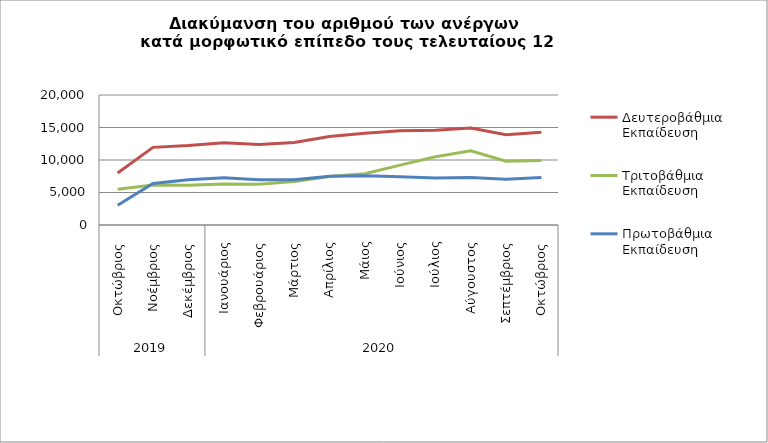
| Category | Δευτεροβάθμια Εκπαίδευση | Τριτοβάθμια Εκπαίδευση | Πρωτοβάθμια Εκπαίδευση |
|---|---|---|---|
| 0 | 7999 | 5505 | 3040 |
| 1 | 11945 | 6155 | 6395 |
| 2 | 12223 | 6111 | 6951 |
| 3 | 12645 | 6303 | 7266 |
| 4 | 12391 | 6258 | 6971 |
| 5 | 12702 | 6691 | 6960 |
| 6 | 13630 | 7456 | 7505 |
| 7 | 14114 | 7899 | 7591 |
| 8 | 14517 | 9211 | 7430 |
| 9 | 14575 | 10490 | 7248 |
| 10 | 14921 | 11427 | 7301 |
| 11 | 13878 | 9807 | 7033 |
| 12 | 14268 | 9928 | 7291 |